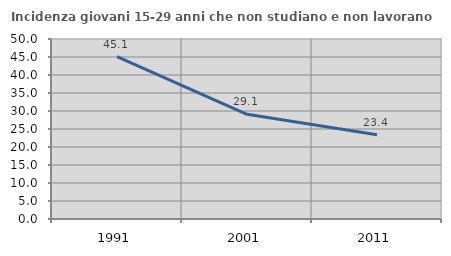
| Category | Incidenza giovani 15-29 anni che non studiano e non lavorano  |
|---|---|
| 1991.0 | 45.077 |
| 2001.0 | 29.091 |
| 2011.0 | 23.404 |